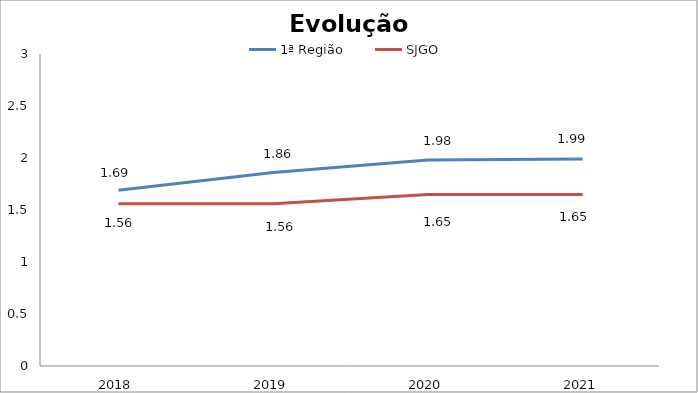
| Category | 1ª Região | SJGO |
|---|---|---|
| 0 | 1.69 | 1.56 |
| 1 | 1.86 | 1.56 |
| 2 | 1.98 | 1.65 |
| 3 | 1.99 | 1.65 |